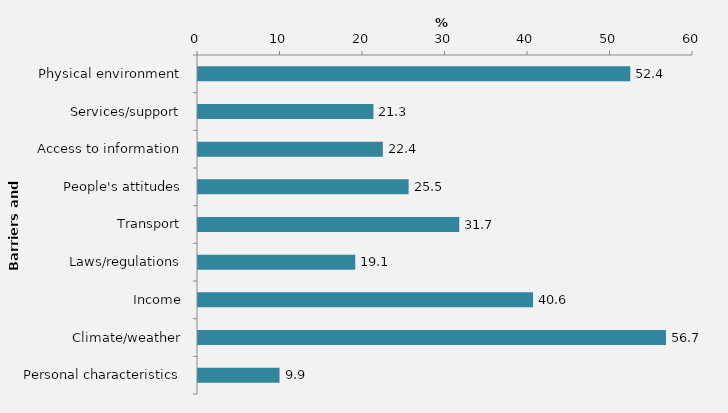
| Category | Series 0 |
|---|---|
| Physical environment | 52.399 |
| Services/support | 21.265 |
| Access to information | 22.403 |
| People's attitudes | 25.529 |
| Transport | 31.667 |
| Laws/regulations | 19.061 |
| Income | 40.614 |
| Climate/weather | 56.721 |
| Personal characteristics | 9.883 |